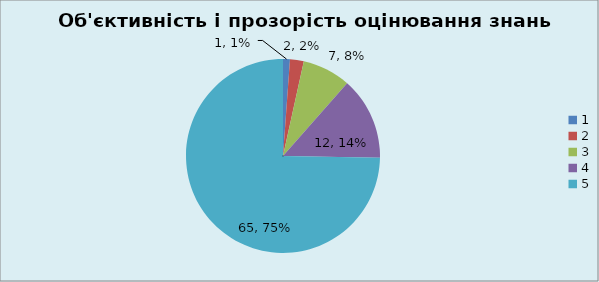
| Category | Кількість | % |
|---|---|---|
| 0 | 1 | 0.011 |
| 1 | 2 | 0.023 |
| 2 | 7 | 0.08 |
| 3 | 12 | 0.138 |
| 4 | 65 | 0.747 |